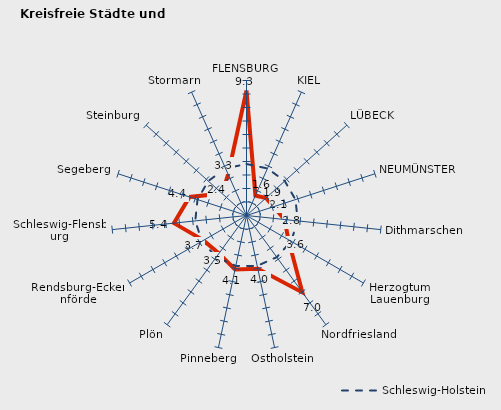
| Category | Kreise | Schleswig-Holstein |
|---|---|---|
| FLENSBURG | 9.262 | 3.815 |
| KIEL | 1.62 | 3.815 |
| LÜBECK | 1.938 | 3.815 |
| NEUMÜNSTER | 2.114 | 3.815 |
| Dithmarschen | 2.838 | 3.815 |
| Herzogtum Lauenburg | 3.579 | 3.815 |
| Nordfriesland | 7.045 | 3.815 |
| Ostholstein | 4.028 | 3.815 |
| Pinneberg | 4.087 | 3.815 |
| Plön | 3.467 | 3.815 |
| Rendsburg-Eckernförde | 3.681 | 3.815 |
| Schleswig-Flensburg | 5.404 | 3.815 |
| Segeberg | 4.438 | 3.815 |
| Steinburg | 2.429 | 3.815 |
| Stormarn | 3.347 | 3.815 |